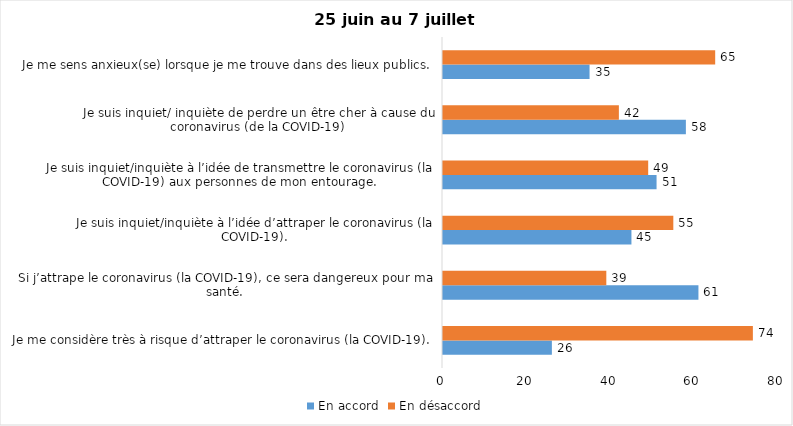
| Category | En accord | En désaccord |
|---|---|---|
| Je me considère très à risque d’attraper le coronavirus (la COVID-19). | 26 | 74 |
| Si j’attrape le coronavirus (la COVID-19), ce sera dangereux pour ma santé. | 61 | 39 |
| Je suis inquiet/inquiète à l’idée d’attraper le coronavirus (la COVID-19). | 45 | 55 |
| Je suis inquiet/inquiète à l’idée de transmettre le coronavirus (la COVID-19) aux personnes de mon entourage. | 51 | 49 |
| Je suis inquiet/ inquiète de perdre un être cher à cause du coronavirus (de la COVID-19) | 58 | 42 |
| Je me sens anxieux(se) lorsque je me trouve dans des lieux publics. | 35 | 65 |